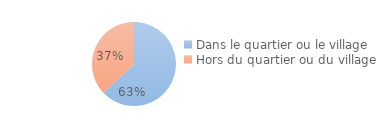
| Category | Series 0 |
|---|---|
| Dans le quartier ou le village | 0.63 |
| Hors du quartier ou du village | 0.37 |
| Ne sait pas/ Refus | 0 |